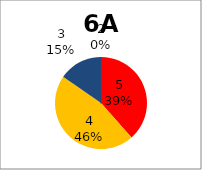
| Category | Series 0 |
|---|---|
| 5.0 | 5 |
| 4.0 | 6 |
| 3.0 | 2 |
| 2.0 | 0 |